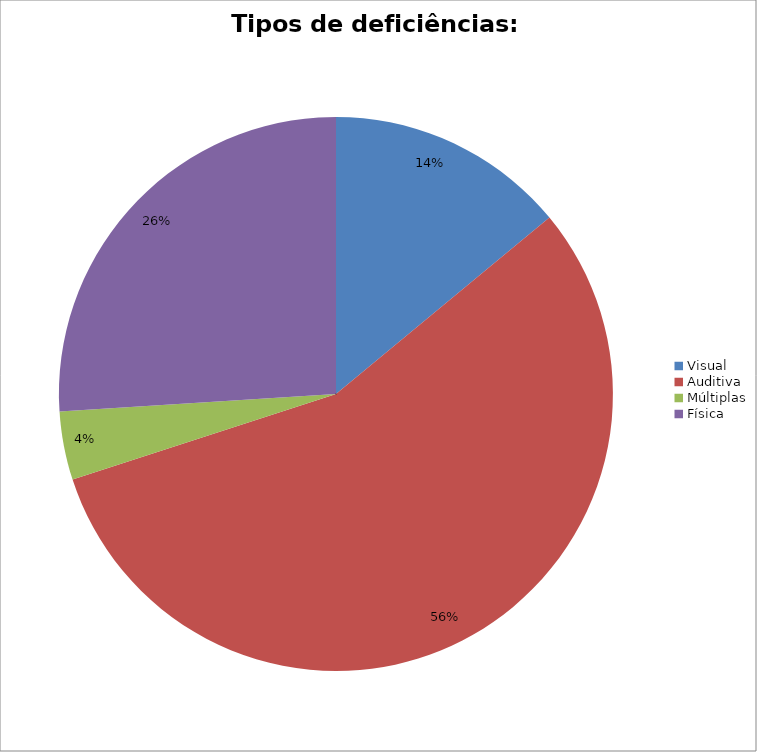
| Category | Tipos de deficiências: Quantitativo |
|---|---|
| Visual | 7 |
| Auditiva | 28 |
| Múltiplas | 2 |
| Física | 13 |